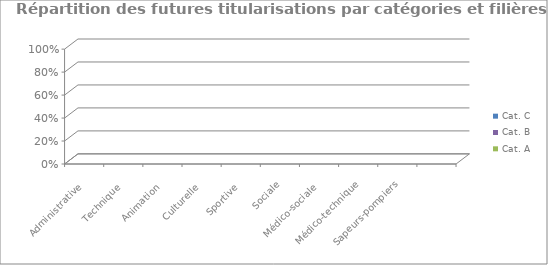
| Category | Cat. A | Cat. B | Cat. C |
|---|---|---|---|
| Administrative | 0 | 0 | 0 |
| Technique | 0 | 0 | 0 |
| Animation | 0 | 0 | 0 |
| Culturelle | 0 | 0 | 0 |
| Sportive | 0 | 0 | 0 |
| Sociale | 0 | 0 | 0 |
| Médico-sociale | 0 | 0 | 0 |
| Médico-technique | 0 | 0 | 0 |
| Sapeurs-pompiers | 0 | 0 | 0 |